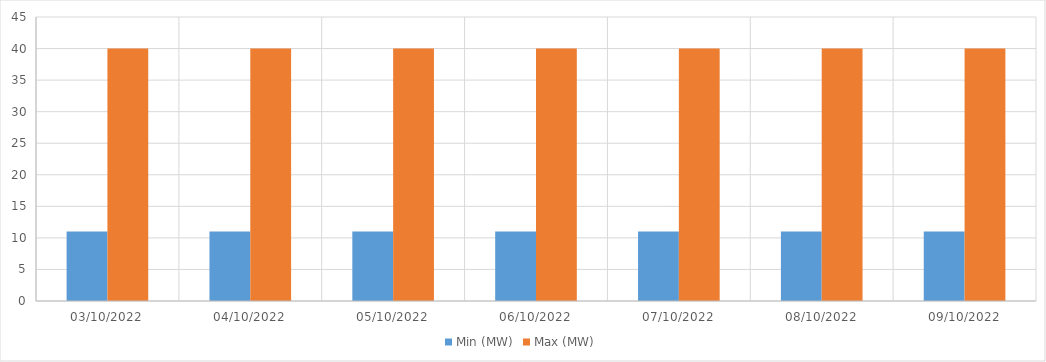
| Category | Min (MW) | Max (MW) |
|---|---|---|
| 03/10/2022 | 11 | 40 |
| 04/10/2022 | 11 | 40 |
| 05/10/2022 | 11 | 40 |
| 06/10/2022 | 11 | 40 |
| 07/10/2022 | 11 | 40 |
| 08/10/2022 | 11 | 40 |
| 09/10/2022 | 11 | 40 |